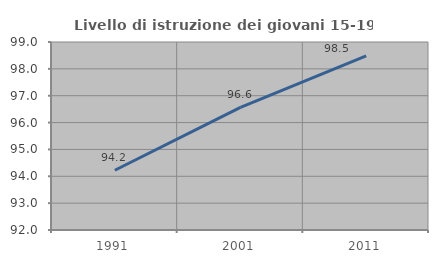
| Category | Livello di istruzione dei giovani 15-19 anni |
|---|---|
| 1991.0 | 94.224 |
| 2001.0 | 96.565 |
| 2011.0 | 98.485 |